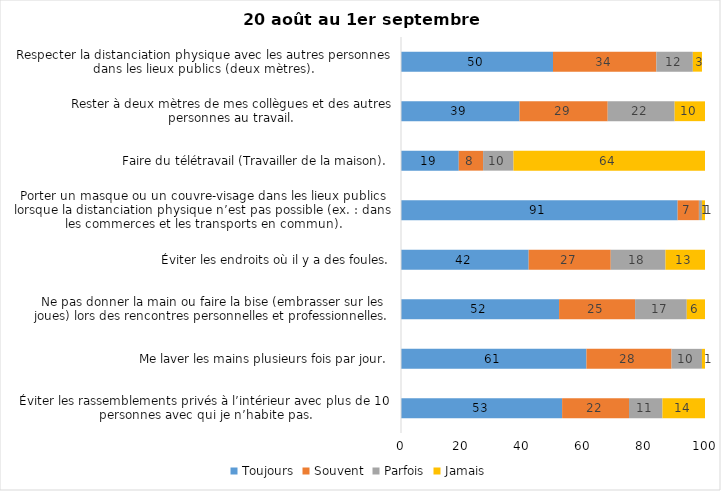
| Category | Toujours | Souvent | Parfois | Jamais |
|---|---|---|---|---|
| Éviter les rassemblements privés à l’intérieur avec plus de 10 personnes avec qui je n’habite pas. | 53 | 22 | 11 | 14 |
| Me laver les mains plusieurs fois par jour. | 61 | 28 | 10 | 1 |
| Ne pas donner la main ou faire la bise (embrasser sur les joues) lors des rencontres personnelles et professionnelles. | 52 | 25 | 17 | 6 |
| Éviter les endroits où il y a des foules. | 42 | 27 | 18 | 13 |
| Porter un masque ou un couvre-visage dans les lieux publics lorsque la distanciation physique n’est pas possible (ex. : dans les commerces et les transports en commun). | 91 | 7 | 1 | 1 |
| Faire du télétravail (Travailler de la maison). | 19 | 8 | 10 | 64 |
| Rester à deux mètres de mes collègues et des autres personnes au travail. | 39 | 29 | 22 | 10 |
| Respecter la distanciation physique avec les autres personnes dans les lieux publics (deux mètres). | 50 | 34 | 12 | 3 |